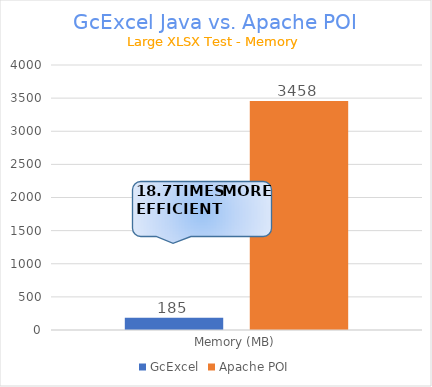
| Category | GcExcel | Apache POI |
|---|---|---|
| Memory (MB) | 185.217 | 3458.328 |